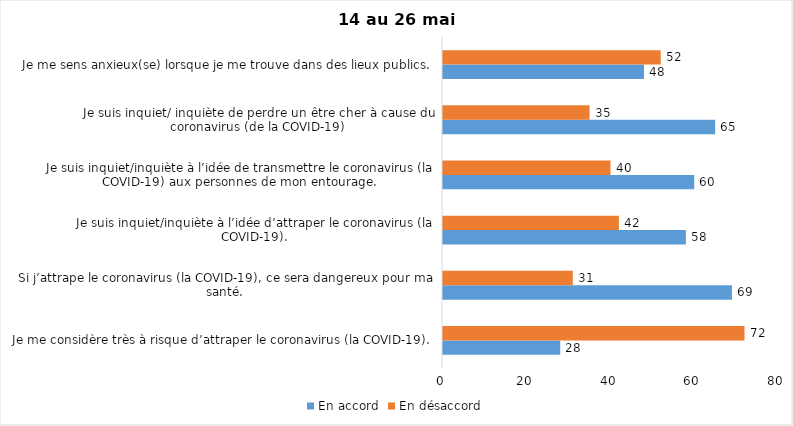
| Category | En accord | En désaccord |
|---|---|---|
| Je me considère très à risque d’attraper le coronavirus (la COVID-19). | 28 | 72 |
| Si j’attrape le coronavirus (la COVID-19), ce sera dangereux pour ma santé. | 69 | 31 |
| Je suis inquiet/inquiète à l’idée d’attraper le coronavirus (la COVID-19). | 58 | 42 |
| Je suis inquiet/inquiète à l’idée de transmettre le coronavirus (la COVID-19) aux personnes de mon entourage. | 60 | 40 |
| Je suis inquiet/ inquiète de perdre un être cher à cause du coronavirus (de la COVID-19) | 65 | 35 |
| Je me sens anxieux(se) lorsque je me trouve dans des lieux publics. | 48 | 52 |